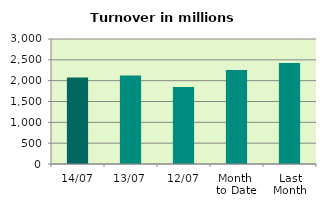
| Category | Series 0 |
|---|---|
| 14/07 | 2078.411 |
| 13/07 | 2125.023 |
| 12/07 | 1849.961 |
| Month 
to Date | 2256.017 |
| Last
Month | 2424.747 |